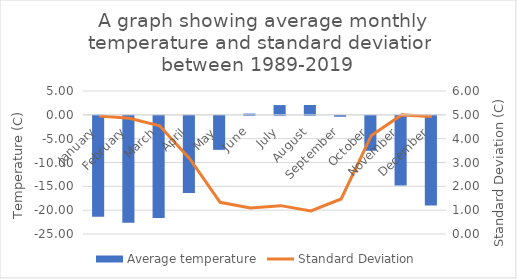
| Category | Average temperature |
|---|---|
| January | -21.197 |
| February | -22.418 |
| March | -21.443 |
| April | -16.203 |
| May | -7.137 |
| June | 0.265 |
| July | 2.048 |
| August | 2.067 |
| September | -0.193 |
| October | -7.323 |
| November | -14.61 |
| December | -18.818 |